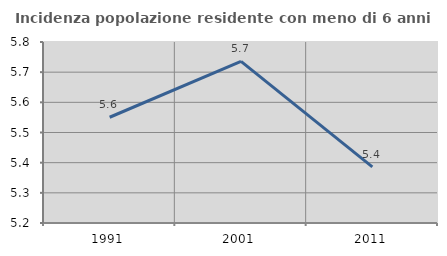
| Category | Incidenza popolazione residente con meno di 6 anni |
|---|---|
| 1991.0 | 5.551 |
| 2001.0 | 5.736 |
| 2011.0 | 5.386 |